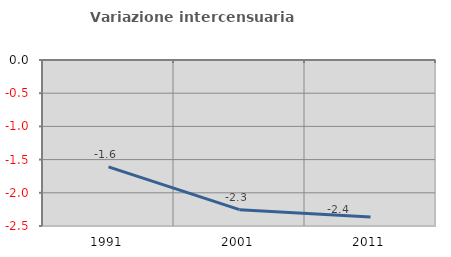
| Category | Variazione intercensuaria annua |
|---|---|
| 1991.0 | -1.61 |
| 2001.0 | -2.254 |
| 2011.0 | -2.363 |